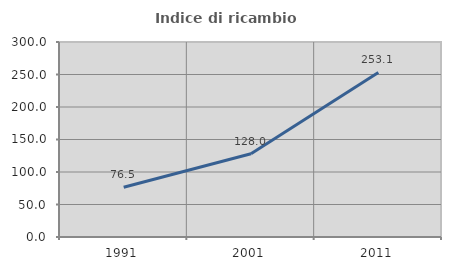
| Category | Indice di ricambio occupazionale  |
|---|---|
| 1991.0 | 76.49 |
| 2001.0 | 128.005 |
| 2011.0 | 253.108 |